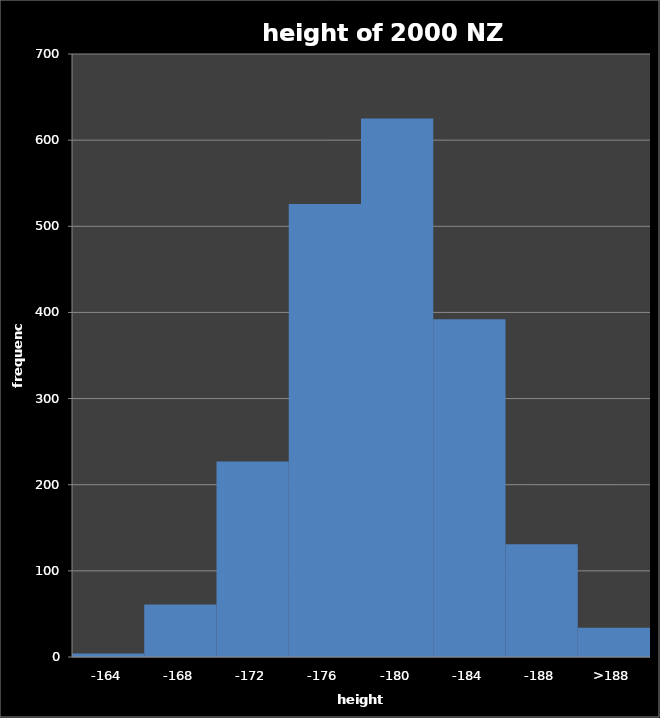
| Category | sample 30 |
|---|---|
| -164 | 4 |
| -168 | 61 |
| -172 | 227 |
| -176 | 526 |
| -180 | 625 |
| -184 | 392 |
| -188 | 131 |
| >188 | 34 |